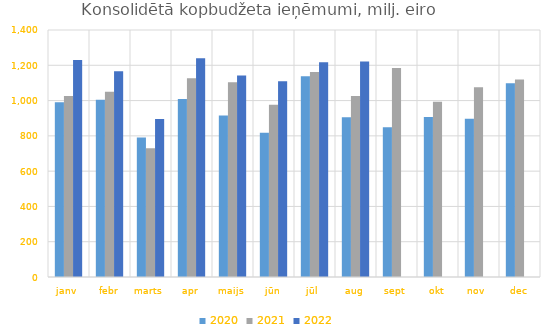
| Category | 2020 | 2021 | 2022 |
|---|---|---|---|
| janv | 990255.966 | 1025729.219 | 1230170.047 |
| febr | 1003986.803 | 1050032.948 | 1166379.907 |
| marts | 790973.859 | 729450.354 | 896198.796 |
| apr | 1008343.173 | 1125852.842 | 1240480.294 |
| maijs | 915661.348 | 1104155.322 | 1141583.555 |
| jūn | 817524.851 | 976600.628 | 1110073.881 |
| jūl | 1137278.065 | 1162632.002 | 1217508.617 |
| aug | 905597.447 | 1025720.022 | 1222030.584 |
| sept | 848822.405 | 1184851.081 | 0 |
| okt | 906227.444 | 993429.183 | 0 |
| nov | 896995.399 | 1074941.099 | 0 |
| dec | 1098839.178 | 1118858.021 | 0 |